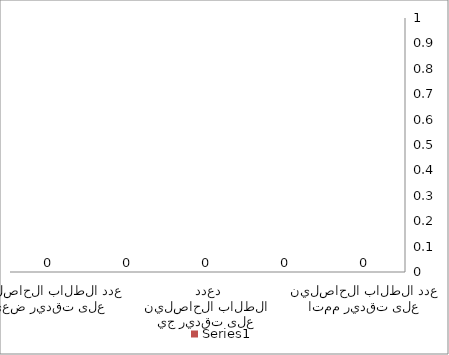
| Category | Series 0 |
|---|---|
| عدد الطلاب الحاصلين على تقدير ممتاز | 0 |
| عدد الطلاب الحاصلين على تقدير جيد جداً | 0 |
| عدد الطلاب الحاصلين على تقدير جيد  | 0 |
| عدد الطلاب الحاصلين على تقدير مقبول | 0 |
| عدد الطلاب الحاصلين على تقدير ضعيف | 0 |